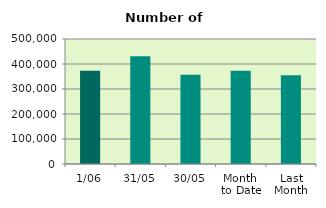
| Category | Series 0 |
|---|---|
| 1/06 | 373072 |
| 31/05 | 431124 |
| 30/05 | 356886 |
| Month 
to Date | 373072 |
| Last
Month | 355289.273 |